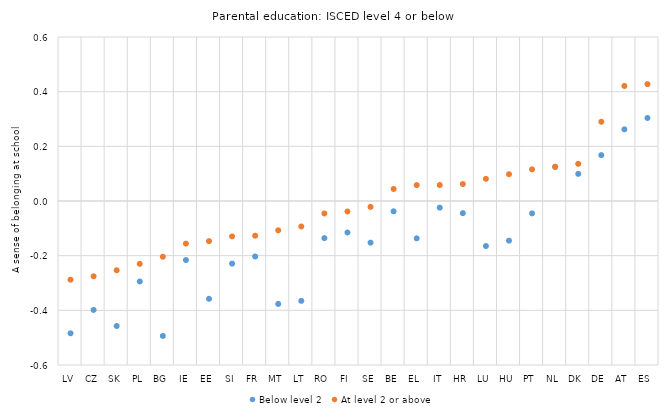
| Category | Below level 2 | At level 2 or above |
|---|---|---|
| LV | -0.484 | -0.288 |
| CZ | -0.399 | -0.275 |
| SK | -0.457 | -0.253 |
| PL | -0.294 | -0.23 |
| BG | -0.494 | -0.204 |
| IE | -0.216 | -0.156 |
| EE | -0.358 | -0.147 |
| SI | -0.229 | -0.129 |
| FR | -0.203 | -0.127 |
| MT | -0.377 | -0.107 |
| LT | -0.365 | -0.093 |
| RO | -0.136 | -0.046 |
| FI | -0.115 | -0.038 |
| SE | -0.152 | -0.022 |
| BE | -0.038 | 0.044 |
| EL | -0.136 | 0.058 |
| IT | -0.024 | 0.058 |
| HR | -0.044 | 0.062 |
| LU | -0.165 | 0.081 |
| HU | -0.145 | 0.098 |
| PT | -0.045 | 0.116 |
| NL | 0.125 | 0.125 |
| DK | 0.099 | 0.136 |
| DE | 0.168 | 0.29 |
| AT | 0.262 | 0.421 |
| ES | 0.304 | 0.428 |